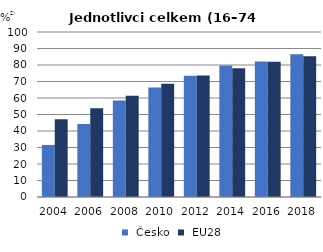
| Category |  Česko |  EU28 |
|---|---|---|
| 2004.0 | 31.551 | 47.124 |
| 2006.0 | 44.253 | 53.845 |
| 2008.0 | 58.412 | 61.354 |
| 2010.0 | 66.36 | 68.7 |
| 2012.0 | 73.43 | 73.61 |
| 2014.0 | 79.709 | 78.008 |
| 2016.0 | 82.172 | 81.988 |
| 2018.0 | 86.502 | 85.24 |